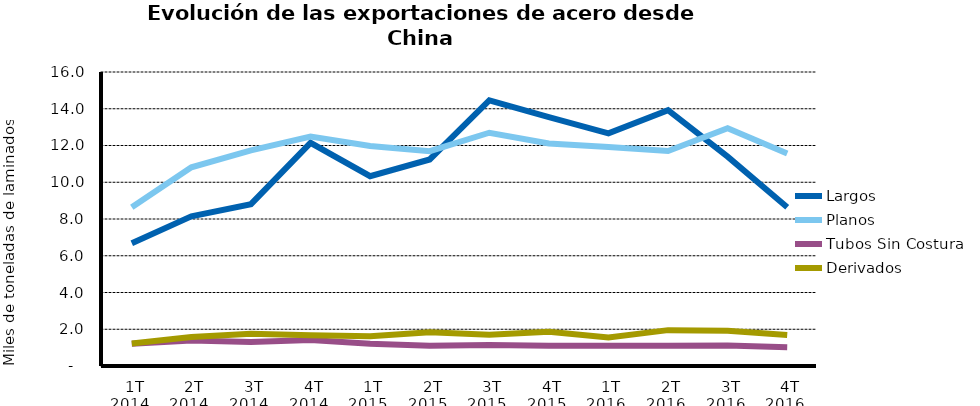
| Category | Largos | Planos | Tubos Sin Costura | Derivados |
|---|---|---|---|---|
| 1T 2014 | 6.679 | 8.636 | 1.212 | 1.228 |
| 2T 2014 | 8.143 | 10.812 | 1.387 | 1.581 |
| 3T 2014 | 8.809 | 11.738 | 1.304 | 1.755 |
| 4T 2014 | 12.146 | 12.486 | 1.411 | 1.671 |
| 1T 2015 | 10.329 | 11.97 | 1.208 | 1.621 |
| 2T 2015 | 11.24 | 11.692 | 1.096 | 1.841 |
| 3T 2015 | 14.457 | 12.695 | 1.145 | 1.704 |
| 4T 2015 | 13.55 | 12.109 | 1.1 | 1.863 |
| 1T 2016 | 12.658 | 11.919 | 1.102 | 1.554 |
| 2T 2016 | 13.926 | 11.701 | 1.103 | 1.952 |
| 3T 2016 | 11.392 | 12.94 | 1.11 | 1.915 |
| 4T 2016 | 8.642 | 11.567 | 1.019 | 1.685 |